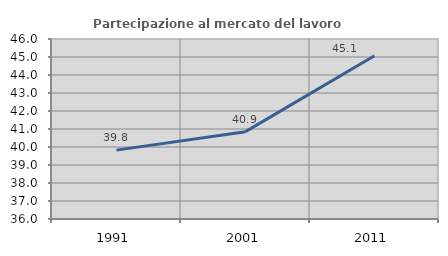
| Category | Partecipazione al mercato del lavoro  femminile |
|---|---|
| 1991.0 | 39.827 |
| 2001.0 | 40.852 |
| 2011.0 | 45.066 |